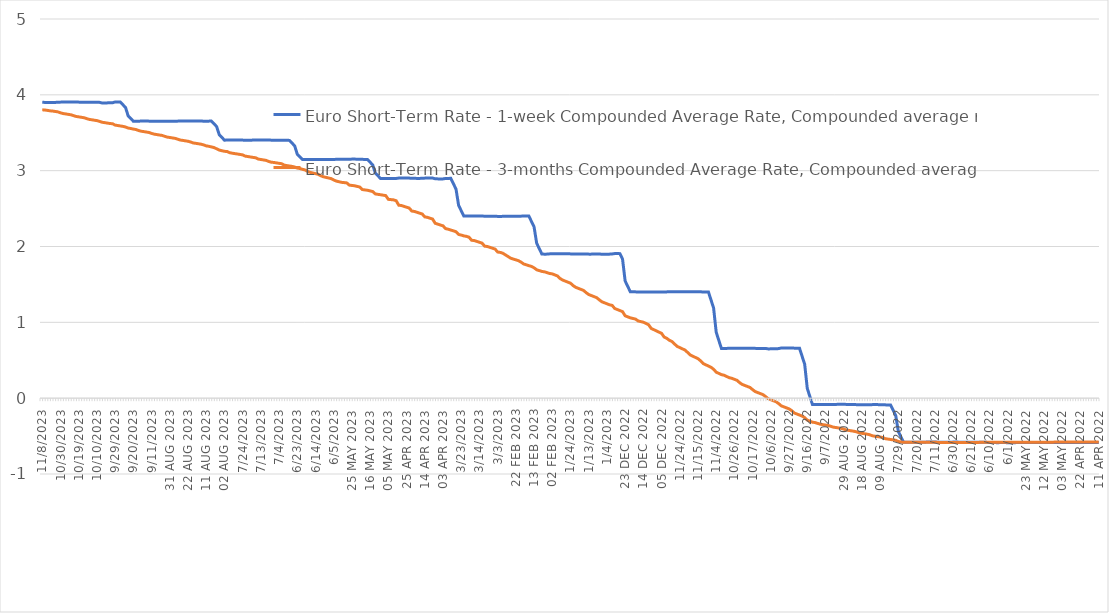
| Category | Euro Short-Term Rate - 1-week Compounded Average Rate, Compounded average rate | Euro Short-Term Rate - 3-months Compounded Average Rate, Compounded average rate |
|---|---|---|
| 08/11/2023 | 3.903 | 3.802 |
| 07/11/2023 | 3.9 | 3.8 |
| 06/11/2023 | 3.9 | 3.795 |
| 03/11/2023 | 3.9 | 3.789 |
| 02/11/2023 | 3.9 | 3.786 |
| 01/11/2023 | 3.9 | 3.781 |
| 31/10/2023 | 3.903 | 3.775 |
| 30/10/2023 | 3.904 | 3.763 |
| 27/10/2023 | 3.905 | 3.753 |
| 26/10/2023 | 3.905 | 3.748 |
| 25/10/2023 | 3.906 | 3.742 |
| 24/10/2023 | 3.906 | 3.737 |
| 23/10/2023 | 3.905 | 3.725 |
| 20/10/2023 | 3.904 | 3.715 |
| 19/10/2023 | 3.904 | 3.709 |
| 18/10/2023 | 3.904 | 3.704 |
| 17/10/2023 | 3.903 | 3.698 |
| 16/10/2023 | 3.903 | 3.687 |
| 13/10/2023 | 3.901 | 3.676 |
| 12/10/2023 | 3.901 | 3.671 |
| 11/10/2023 | 3.901 | 3.666 |
| 10/10/2023 | 3.901 | 3.66 |
| 09/10/2023 | 3.901 | 3.65 |
| 06/10/2023 | 3.893 | 3.638 |
| 05/10/2023 | 3.893 | 3.633 |
| 04/10/2023 | 3.894 | 3.628 |
| 03/10/2023 | 3.895 | 3.622 |
| 02/10/2023 | 3.895 | 3.619 |
| 29/09/2023 | 3.906 | 3.601 |
| 28/09/2023 | 3.905 | 3.595 |
| 27/09/2023 | 3.905 | 3.59 |
| 26/09/2023 | 3.869 | 3.584 |
| 25/09/2023 | 3.832 | 3.575 |
| 22/09/2023 | 3.723 | 3.562 |
| 21/09/2023 | 3.687 | 3.556 |
| 20/09/2023 | 3.652 | 3.548 |
| 19/09/2023 | 3.652 | 3.543 |
| 18/09/2023 | 3.653 | 3.529 |
| 15/09/2023 | 3.654 | 3.52 |
| 14/09/2023 | 3.654 | 3.515 |
| 13/09/2023 | 3.654 | 3.509 |
| 12/09/2023 | 3.653 | 3.504 |
| 11/09/2023 | 3.653 | 3.491 |
| 08/09/2023 | 3.653 | 3.482 |
| 07/09/2023 | 3.652 | 3.476 |
| 06/09/2023 | 3.652 | 3.47 |
| 05/09/2023 | 3.652 | 3.465 |
| 04/09/2023 | 3.652 | 3.453 |
| 01/09/2023 | 3.652 | 3.443 |
| 31 Aug 2023 | 3.652 | 3.437 |
| 30 Aug 2023 | 3.652 | 3.432 |
| 29 Aug 2023 | 3.653 | 3.426 |
| 28 Aug 2023 | 3.653 | 3.416 |
| 25 Aug 2023 | 3.655 | 3.404 |
| 24 Aug 2023 | 3.655 | 3.399 |
| 23 Aug 2023 | 3.656 | 3.393 |
| 22 Aug 2023 | 3.656 | 3.388 |
| 21 Aug 2023 | 3.656 | 3.378 |
| 18 Aug 2023 | 3.655 | 3.366 |
| 17 Aug 2023 | 3.655 | 3.36 |
| 16 Aug 2023 | 3.654 | 3.355 |
| 15 Aug 2023 | 3.654 | 3.349 |
| 14 Aug 2023 | 3.653 | 3.34 |
| 11 Aug 2023 | 3.653 | 3.327 |
| 10 Aug 2023 | 3.653 | 3.321 |
| 09 Aug 2023 | 3.654 | 3.313 |
| 08 Aug 2023 | 3.619 | 3.305 |
| 07 Aug 2023 | 3.581 | 3.288 |
| 04 Aug 2023 | 3.475 | 3.272 |
| 03 Aug 2023 | 3.439 | 3.263 |
| 02 Aug 2023 | 3.403 | 3.255 |
| 01 Aug 2023 | 3.403 | 3.253 |
| 31/07/2023 | 3.405 | 3.237 |
| 28/07/2023 | 3.405 | 3.231 |
| 27/07/2023 | 3.405 | 3.225 |
| 26/07/2023 | 3.404 | 3.219 |
| 25/07/2023 | 3.404 | 3.214 |
| 24/07/2023 | 3.403 | 3.208 |
| 21/07/2023 | 3.402 | 3.192 |
| 20/07/2023 | 3.402 | 3.186 |
| 19/07/2023 | 3.402 | 3.181 |
| 18/07/2023 | 3.403 | 3.175 |
| 17/07/2023 | 3.403 | 3.17 |
| 14/07/2023 | 3.405 | 3.153 |
| 13/07/2023 | 3.406 | 3.147 |
| 12/07/2023 | 3.406 | 3.142 |
| 11/07/2023 | 3.405 | 3.136 |
| 10/07/2023 | 3.405 | 3.122 |
| 07/07/2023 | 3.402 | 3.112 |
| 06/07/2023 | 3.401 | 3.108 |
| 05/07/2023 | 3.401 | 3.103 |
| 04/07/2023 | 3.4 | 3.097 |
| 03/07/2023 | 3.4 | 3.091 |
| 30/06/2023 | 3.4 | 3.073 |
| 29/06/2023 | 3.4 | 3.067 |
| 28/06/2023 | 3.399 | 3.062 |
| 27/06/2023 | 3.363 | 3.056 |
| 26/06/2023 | 3.326 | 3.048 |
| 23/06/2023 | 3.217 | 3.034 |
| 22/06/2023 | 3.181 | 3.029 |
| 21/06/2023 | 3.146 | 3.018 |
| 20/06/2023 | 3.146 | 3.01 |
| 19/06/2023 | 3.147 | 2.989 |
| 16/06/2023 | 3.148 | 2.977 |
| 15/06/2023 | 3.148 | 2.969 |
| 14/06/2023 | 3.147 | 2.961 |
| 13/06/2023 | 3.147 | 2.952 |
| 12/06/2023 | 3.147 | 2.933 |
| 09/06/2023 | 3.147 | 2.92 |
| 08/06/2023 | 3.148 | 2.912 |
| 07/06/2023 | 3.148 | 2.904 |
| 06/06/2023 | 3.148 | 2.895 |
| 05/06/2023 | 3.148 | 2.877 |
| 02/06/2023 | 3.15 | 2.863 |
| 01/06/2023 | 3.15 | 2.854 |
| 31 May 2023 | 3.15 | 2.846 |
| 30 May 2023 | 3.152 | 2.843 |
| 29 May 2023 | 3.152 | 2.839 |
| 26 May 2023 | 3.152 | 2.809 |
| 25 May 2023 | 3.152 | 2.805 |
| 24 May 2023 | 3.153 | 2.801 |
| 23 May 2023 | 3.151 | 2.793 |
| 22 May 2023 | 3.151 | 2.784 |
| 19 May 2023 | 3.149 | 2.751 |
| 18 May 2023 | 3.148 | 2.746 |
| 17 May 2023 | 3.147 | 2.741 |
| 16 May 2023 | 3.111 | 2.733 |
| 15 May 2023 | 3.075 | 2.725 |
| 12 May 2023 | 2.968 | 2.693 |
| 11 May 2023 | 2.932 | 2.688 |
| 10 May 2023 | 2.897 | 2.682 |
| 09 May 2023 | 2.897 | 2.677 |
| 08 May 2023 | 2.897 | 2.671 |
| 05 May 2023 | 2.896 | 2.622 |
| 04 May 2023 | 2.896 | 2.618 |
| 03 May 2023 | 2.896 | 2.615 |
| 02 May 2023 | 2.897 | 2.604 |
| 28 Apr 2023 | 2.902 | 2.545 |
| 27 Apr 2023 | 2.903 | 2.541 |
| 26 Apr 2023 | 2.903 | 2.529 |
| 25 Apr 2023 | 2.903 | 2.518 |
| 24 Apr 2023 | 2.902 | 2.507 |
| 21 Apr 2023 | 2.899 | 2.467 |
| 20 Apr 2023 | 2.899 | 2.462 |
| 19 Apr 2023 | 2.898 | 2.451 |
| 18 Apr 2023 | 2.898 | 2.44 |
| 17 Apr 2023 | 2.901 | 2.429 |
| 14 Apr 2023 | 2.902 | 2.39 |
| 13 Apr 2023 | 2.902 | 2.384 |
| 12 Apr 2023 | 2.902 | 2.373 |
| 11 Apr 2023 | 2.903 | 2.362 |
| 06 Apr 2023 | 2.893 | 2.306 |
| 05 Apr 2023 | 2.892 | 2.295 |
| 04 Apr 2023 | 2.891 | 2.284 |
| 03 Apr 2023 | 2.891 | 2.273 |
| 31/03/2023 | 2.898 | 2.236 |
| 30/03/2023 | 2.898 | 2.228 |
| 29/03/2023 | 2.899 | 2.217 |
| 28/03/2023 | 2.828 | 2.206 |
| 27/03/2023 | 2.756 | 2.195 |
| 24/03/2023 | 2.543 | 2.159 |
| 23/03/2023 | 2.472 | 2.151 |
| 22/03/2023 | 2.401 | 2.14 |
| 21/03/2023 | 2.401 | 2.134 |
| 20/03/2023 | 2.401 | 2.123 |
| 17/03/2023 | 2.402 | 2.082 |
| 16/03/2023 | 2.402 | 2.078 |
| 15/03/2023 | 2.402 | 2.067 |
| 14/03/2023 | 2.402 | 2.056 |
| 13/03/2023 | 2.401 | 2.045 |
| 10/03/2023 | 2.4 | 2.005 |
| 09/03/2023 | 2.4 | 2 |
| 08/03/2023 | 2.4 | 1.989 |
| 07/03/2023 | 2.398 | 1.978 |
| 06/03/2023 | 2.398 | 1.967 |
| 03/03/2023 | 2.397 | 1.927 |
| 02/03/2023 | 2.397 | 1.922 |
| 01/03/2023 | 2.397 | 1.911 |
| 28 Feb 2023 | 2.399 | 1.889 |
| 27 Feb 2023 | 2.399 | 1.868 |
| 24 Feb 2023 | 2.399 | 1.846 |
| 23 Feb 2023 | 2.399 | 1.835 |
| 22 Feb 2023 | 2.4 | 1.824 |
| 21 Feb 2023 | 2.4 | 1.813 |
| 20 Feb 2023 | 2.4 | 1.794 |
| 17 Feb 2023 | 2.402 | 1.77 |
| 16 Feb 2023 | 2.402 | 1.759 |
| 15 Feb 2023 | 2.401 | 1.748 |
| 14 Feb 2023 | 2.33 | 1.737 |
| 13 Feb 2023 | 2.259 | 1.719 |
| 10 Feb 2023 | 2.043 | 1.693 |
| 09 Feb 2023 | 1.972 | 1.682 |
| 08 Feb 2023 | 1.9 | 1.671 |
| 07 Feb 2023 | 1.899 | 1.666 |
| 06 Feb 2023 | 1.9 | 1.655 |
| 03 Feb 2023 | 1.903 | 1.644 |
| 02 Feb 2023 | 1.903 | 1.639 |
| 01 Feb 2023 | 1.904 | 1.625 |
| 31/01/2023 | 1.905 | 1.612 |
| 30/01/2023 | 1.905 | 1.578 |
| 27/01/2023 | 1.904 | 1.557 |
| 26/01/2023 | 1.903 | 1.543 |
| 25/01/2023 | 1.903 | 1.53 |
| 24/01/2023 | 1.903 | 1.516 |
| 23/01/2023 | 1.903 | 1.485 |
| 20/01/2023 | 1.902 | 1.462 |
| 19/01/2023 | 1.901 | 1.448 |
| 18/01/2023 | 1.901 | 1.435 |
| 17/01/2023 | 1.901 | 1.421 |
| 16/01/2023 | 1.901 | 1.392 |
| 13/01/2023 | 1.899 | 1.367 |
| 12/01/2023 | 1.899 | 1.353 |
| 11/01/2023 | 1.9 | 1.34 |
| 10/01/2023 | 1.901 | 1.326 |
| 09/01/2023 | 1.901 | 1.299 |
| 06/01/2023 | 1.898 | 1.272 |
| 05/01/2023 | 1.899 | 1.258 |
| 04/01/2023 | 1.899 | 1.245 |
| 03/01/2023 | 1.899 | 1.231 |
| 02/01/2023 | 1.902 | 1.224 |
| 30 Dec 2022 | 1.907 | 1.182 |
| 29 Dec 2022 | 1.906 | 1.169 |
| 28 Dec 2022 | 1.906 | 1.155 |
| 27 Dec 2022 | 1.834 | 1.141 |
| 23 Dec 2022 | 1.546 | 1.086 |
| 22 Dec 2022 | 1.474 | 1.073 |
| 21 Dec 2022 | 1.403 | 1.059 |
| 20 Dec 2022 | 1.402 | 1.051 |
| 19 Dec 2022 | 1.402 | 1.043 |
| 16 Dec 2022 | 1.401 | 1.018 |
| 15 Dec 2022 | 1.4 | 1.01 |
| 14 Dec 2022 | 1.4 | 1.002 |
| 13 Dec 2022 | 1.401 | 0.985 |
| 12 Dec 2022 | 1.401 | 0.969 |
| 09 Dec 2022 | 1.401 | 0.92 |
| 08 Dec 2022 | 1.401 | 0.904 |
| 07 Dec 2022 | 1.399 | 0.887 |
| 06 Dec 2022 | 1.399 | 0.871 |
| 05 Dec 2022 | 1.4 | 0.855 |
| 02 Dec 2022 | 1.401 | 0.806 |
| 01 Dec 2022 | 1.402 | 0.789 |
| 30/11/2022 | 1.404 | 0.764 |
| 29/11/2022 | 1.404 | 0.747 |
| 28/11/2022 | 1.404 | 0.714 |
| 25/11/2022 | 1.404 | 0.683 |
| 24/11/2022 | 1.403 | 0.667 |
| 23/11/2022 | 1.403 | 0.651 |
| 22/11/2022 | 1.402 | 0.634 |
| 21/11/2022 | 1.402 | 0.603 |
| 18/11/2022 | 1.402 | 0.57 |
| 17/11/2022 | 1.402 | 0.553 |
| 16/11/2022 | 1.402 | 0.537 |
| 15/11/2022 | 1.402 | 0.521 |
| 14/11/2022 | 1.402 | 0.492 |
| 11/11/2022 | 1.401 | 0.456 |
| 10/11/2022 | 1.401 | 0.44 |
| 09/11/2022 | 1.401 | 0.424 |
| 08/11/2022 | 1.296 | 0.408 |
| 07/11/2022 | 1.188 | 0.381 |
| 04/11/2022 | 0.869 | 0.343 |
| 03/11/2022 | 0.762 | 0.327 |
| 02/11/2022 | 0.655 | 0.311 |
| 01/11/2022 | 0.655 | 0.302 |
| 31/10/2022 | 0.656 | 0.286 |
| 28/10/2022 | 0.657 | 0.27 |
| 27/10/2022 | 0.657 | 0.262 |
| 26/10/2022 | 0.657 | 0.249 |
| 25/10/2022 | 0.657 | 0.235 |
| 24/10/2022 | 0.657 | 0.204 |
| 21/10/2022 | 0.657 | 0.181 |
| 20/10/2022 | 0.657 | 0.168 |
| 19/10/2022 | 0.657 | 0.154 |
| 18/10/2022 | 0.657 | 0.141 |
| 17/10/2022 | 0.657 | 0.112 |
| 14/10/2022 | 0.657 | 0.087 |
| 13/10/2022 | 0.656 | 0.073 |
| 12/10/2022 | 0.655 | 0.06 |
| 11/10/2022 | 0.655 | 0.046 |
| 10/10/2022 | 0.655 | 0.02 |
| 07/10/2022 | 0.649 | -0.007 |
| 06/10/2022 | 0.65 | -0.021 |
| 05/10/2022 | 0.652 | -0.034 |
| 04/10/2022 | 0.652 | -0.048 |
| 03/10/2022 | 0.653 | -0.072 |
| 30/09/2022 | 0.662 | -0.101 |
| 29/09/2022 | 0.662 | -0.114 |
| 28/09/2022 | 0.662 | -0.128 |
| 27/09/2022 | 0.661 | -0.141 |
| 26/09/2022 | 0.661 | -0.164 |
| 23/09/2022 | 0.66 | -0.195 |
| 22/09/2022 | 0.66 | -0.209 |
| 21/09/2022 | 0.66 | -0.222 |
| 20/09/2022 | 0.554 | -0.236 |
| 19/09/2022 | 0.448 | -0.256 |
| 16/09/2022 | 0.128 | -0.29 |
| 15/09/2022 | 0.022 | -0.303 |
| 14/09/2022 | -0.084 | -0.317 |
| 13/09/2022 | -0.084 | -0.322 |
| 12/09/2022 | -0.084 | -0.333 |
| 09/09/2022 | -0.083 | -0.344 |
| 08/09/2022 | -0.083 | -0.349 |
| 07/09/2022 | -0.085 | -0.354 |
| 06/09/2022 | -0.085 | -0.36 |
| 05/09/2022 | -0.084 | -0.37 |
| 02/09/2022 | -0.083 | -0.382 |
| 01/09/2022 | -0.082 | -0.387 |
| 31 Aug 2022 | -0.081 | -0.393 |
| 30 Aug 2022 | -0.08 | -0.398 |
| 29 Aug 2022 | -0.081 | -0.407 |
| 26 Aug 2022 | -0.082 | -0.42 |
| 25 Aug 2022 | -0.083 | -0.426 |
| 24 Aug 2022 | -0.084 | -0.431 |
| 23 Aug 2022 | -0.085 | -0.436 |
| 22 Aug 2022 | -0.085 | -0.445 |
| 19 Aug 2022 | -0.087 | -0.458 |
| 18 Aug 2022 | -0.087 | -0.464 |
| 17 Aug 2022 | -0.087 | -0.469 |
| 16 Aug 2022 | -0.087 | -0.475 |
| 15 Aug 2022 | -0.086 | -0.482 |
| 12 Aug 2022 | -0.085 | -0.496 |
| 11 Aug 2022 | -0.085 | -0.501 |
| 10 Aug 2022 | -0.085 | -0.507 |
| 09 Aug 2022 | -0.085 | -0.512 |
| 08 Aug 2022 | -0.086 | -0.519 |
| 05 Aug 2022 | -0.088 | -0.534 |
| 04 Aug 2022 | -0.089 | -0.539 |
| 03 Aug 2022 | -0.089 | -0.545 |
| 02 Aug 2022 | -0.159 | -0.55 |
| 01 Aug 2022 | -0.23 | -0.555 |
| 29/07/2022 | -0.44 | -0.572 |
| 28/07/2022 | -0.511 | -0.577 |
| 27/07/2022 | -0.582 | -0.582 |
| 26/07/2022 | -0.583 | -0.582 |
| 25/07/2022 | -0.582 | -0.583 |
| 22/07/2022 | -0.582 | -0.583 |
| 21/07/2022 | -0.582 | -0.583 |
| 20/07/2022 | -0.582 | -0.583 |
| 19/07/2022 | -0.582 | -0.583 |
| 18/07/2022 | -0.581 | -0.583 |
| 15/07/2022 | -0.58 | -0.583 |
| 14/07/2022 | -0.58 | -0.583 |
| 13/07/2022 | -0.579 | -0.583 |
| 12/07/2022 | -0.579 | -0.583 |
| 11/07/2022 | -0.579 | -0.583 |
| 08/07/2022 | -0.58 | -0.583 |
| 07/07/2022 | -0.582 | -0.583 |
| 06/07/2022 | -0.581 | -0.583 |
| 05/07/2022 | -0.581 | -0.583 |
| 04/07/2022 | -0.581 | -0.583 |
| 01/07/2022 | -0.581 | -0.583 |
| 30/06/2022 | -0.579 | -0.583 |
| 29/06/2022 | -0.58 | -0.583 |
| 28/06/2022 | -0.58 | -0.583 |
| 27/06/2022 | -0.58 | -0.583 |
| 24/06/2022 | -0.581 | -0.583 |
| 23/06/2022 | -0.581 | -0.583 |
| 22/06/2022 | -0.582 | -0.583 |
| 21/06/2022 | -0.581 | -0.583 |
| 20/06/2022 | -0.581 | -0.583 |
| 17/06/2022 | -0.58 | -0.583 |
| 16/06/2022 | -0.58 | -0.583 |
| 15/06/2022 | -0.581 | -0.583 |
| 14/06/2022 | -0.581 | -0.583 |
| 13/06/2022 | -0.583 | -0.583 |
| 10/06/2022 | -0.585 | -0.583 |
| 09/06/2022 | -0.586 | -0.583 |
| 08/06/2022 | -0.586 | -0.583 |
| 07/06/2022 | -0.587 | -0.583 |
| 06/06/2022 | -0.586 | -0.582 |
| 03/06/2022 | -0.585 | -0.582 |
| 02/06/2022 | -0.586 | -0.582 |
| 01/06/2022 | -0.587 | -0.582 |
| 31 May 2022 | -0.586 | -0.582 |
| 30 May 2022 | -0.586 | -0.582 |
| 27 May 2022 | -0.586 | -0.582 |
| 26 May 2022 | -0.586 | -0.582 |
| 25 May 2022 | -0.585 | -0.581 |
| 24 May 2022 | -0.585 | -0.581 |
| 23 May 2022 | -0.585 | -0.581 |
| 20 May 2022 | -0.585 | -0.581 |
| 19 May 2022 | -0.584 | -0.581 |
| 18 May 2022 | -0.584 | -0.581 |
| 17 May 2022 | -0.584 | -0.581 |
| 16 May 2022 | -0.584 | -0.581 |
| 13 May 2022 | -0.584 | -0.58 |
| 12 May 2022 | -0.585 | -0.58 |
| 11 May 2022 | -0.585 | -0.58 |
| 10 May 2022 | -0.584 | -0.58 |
| 09 May 2022 | -0.584 | -0.58 |
| 06 May 2022 | -0.584 | -0.58 |
| 05 May 2022 | -0.584 | -0.58 |
| 04 May 2022 | -0.584 | -0.58 |
| 03 May 2022 | -0.584 | -0.579 |
| 02 May 2022 | -0.584 | -0.579 |
| 29 Apr 2022 | -0.583 | -0.579 |
| 28 Apr 2022 | -0.583 | -0.579 |
| 27 Apr 2022 | -0.583 | -0.579 |
| 26 Apr 2022 | -0.583 | -0.579 |
| 25 Apr 2022 | -0.584 | -0.579 |
| 22 Apr 2022 | -0.585 | -0.579 |
| 21 Apr 2022 | -0.585 | -0.578 |
| 20 Apr 2022 | -0.585 | -0.578 |
| 19 Apr 2022 | -0.585 | -0.578 |
| 14 Apr 2022 | -0.583 | -0.578 |
| 13 Apr 2022 | -0.583 | -0.578 |
| 12 Apr 2022 | -0.584 | -0.578 |
| 11 Apr 2022 | -0.584 | -0.578 |